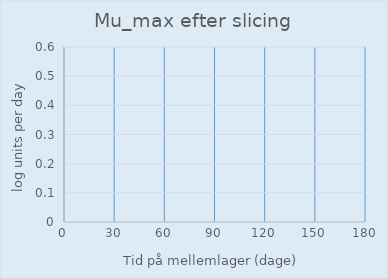
| Category | Series 0 |
|---|---|
| 0.0 | 0 |
| 5.0 | 0 |
| 10.0 | 0 |
| 15.0 | 0 |
| 20.0 | 0 |
| 25.0 | 0 |
| 30.0 | 0 |
| 35.0 | 0 |
| 40.0 | 0 |
| 45.0 | 0 |
| 50.0 | 0 |
| 55.0 | 0 |
| 60.0 | 0 |
| 65.0 | 0 |
| 70.0 | 0 |
| 75.0 | 0 |
| 80.0 | 0 |
| 85.0 | 0 |
| 90.0 | 0 |
| 95.0 | 0 |
| 100.0 | 0 |
| 105.0 | 0 |
| 110.0 | 0 |
| 115.0 | 0 |
| 120.0 | 0 |
| 125.0 | 0 |
| 130.0 | 0 |
| 135.0 | 0 |
| 140.0 | 0 |
| 145.0 | 0 |
| 150.0 | 0 |
| 155.0 | 0 |
| 160.0 | 0 |
| 165.0 | 0 |
| 170.0 | 0 |
| 175.0 | 0 |
| 180.0 | 0 |
| 185.0 | 0 |
| 190.0 | 0 |
| 195.0 | 0 |
| 200.0 | 0 |
| 205.0 | 0 |
| 210.0 | 0 |
| 215.0 | 0 |
| 220.0 | 0 |
| 225.0 | 0 |
| 230.0 | 0 |
| 235.0 | 0 |
| 240.0 | 0 |
| 245.0 | 0 |
| 250.0 | 0 |
| 255.0 | 0 |
| 260.0 | 0 |
| 265.0 | 0 |
| 270.0 | 0 |
| 275.0 | 0 |
| 280.0 | 0 |
| 285.0 | 0 |
| 290.0 | 0 |
| 295.0 | 0 |
| 300.0 | 0 |
| 305.0 | 0 |
| 310.0 | 0 |
| 315.0 | 0 |
| 320.0 | 0 |
| 325.0 | 0 |
| 330.0 | 0 |
| 335.0 | 0 |
| 340.0 | 0 |
| 345.0 | 0 |
| 350.0 | 0 |
| 355.0 | 0 |
| 360.0 | 0 |
| 365.0 | 0 |